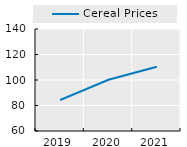
| Category | Cereal Prices |
|---|---|
| 2019.0 | 84.323 |
| 2020.0 | 100.192 |
| 2021.0 | 110.333 |